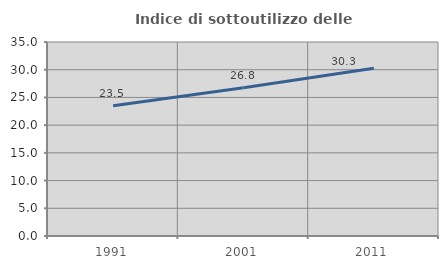
| Category | Indice di sottoutilizzo delle abitazioni  |
|---|---|
| 1991.0 | 23.49 |
| 2001.0 | 26.751 |
| 2011.0 | 30.271 |